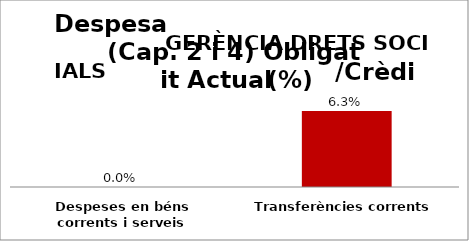
| Category | Series 0 |
|---|---|
| Despeses en béns corrents i serveis | 0 |
| Transferències corrents | 0.063 |